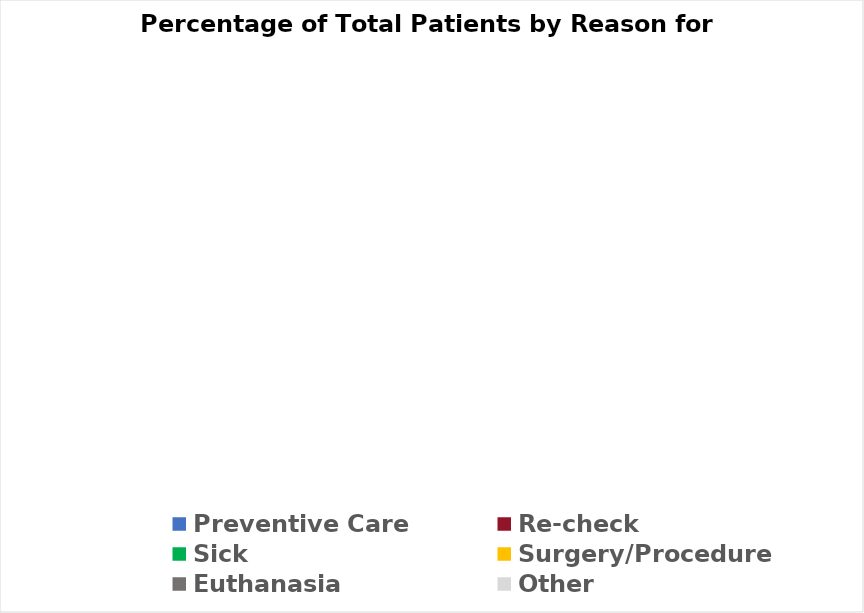
| Category | Series 0 |
|---|---|
| Preventive Care | 0 |
| Re-check | 0 |
| Sick | 0 |
| Surgery/Procedure | 0 |
| Euthanasia | 0 |
| Other | 0 |